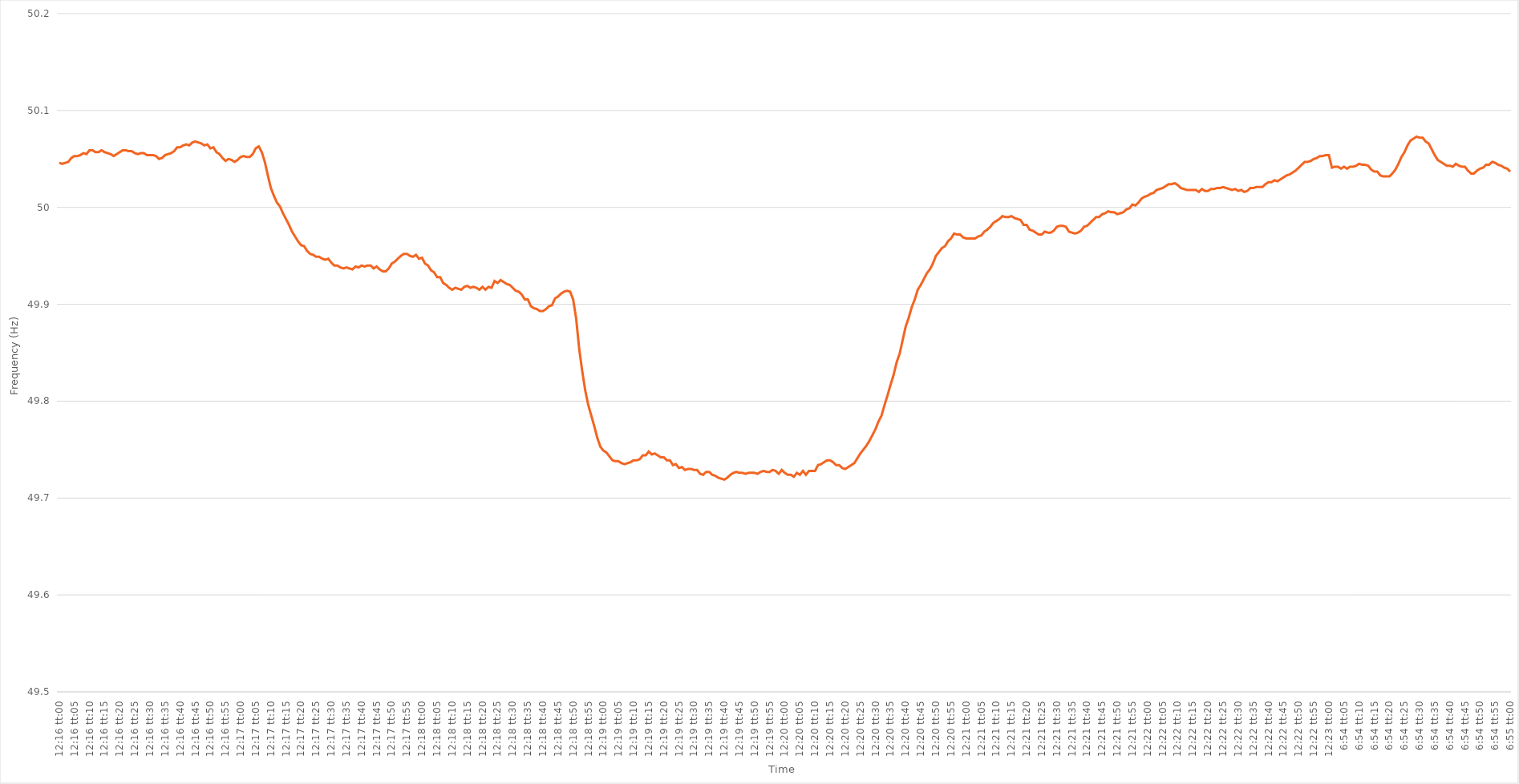
| Category | Series 0 |
|---|---|
| 0.5111111111111112 | 50.046 |
| 0.5111226851851852 | 50.045 |
| 0.5111342592592593 | 50.046 |
| 0.5111458333333333 | 50.047 |
| 0.5111574074074073 | 50.051 |
| 0.5111689814814815 | 50.053 |
| 0.5111805555555555 | 50.053 |
| 0.5111921296296297 | 50.054 |
| 0.5112037037037037 | 50.056 |
| 0.5112152777777778 | 50.055 |
| 0.5112268518518518 | 50.059 |
| 0.5112384259259259 | 50.059 |
| 0.51125 | 50.057 |
| 0.5112615740740741 | 50.057 |
| 0.5112731481481482 | 50.059 |
| 0.5112847222222222 | 50.057 |
| 0.5112962962962962 | 50.056 |
| 0.5113078703703704 | 50.055 |
| 0.5113194444444444 | 50.053 |
| 0.5113310185185186 | 50.055 |
| 0.5113425925925926 | 50.057 |
| 0.5113541666666667 | 50.059 |
| 0.5113657407407407 | 50.059 |
| 0.5113773148148147 | 50.058 |
| 0.5113888888888889 | 50.058 |
| 0.5114004629629629 | 50.056 |
| 0.5114120370370371 | 50.055 |
| 0.5114236111111111 | 50.056 |
| 0.5114351851851852 | 50.056 |
| 0.5114467592592592 | 50.054 |
| 0.5114583333333333 | 50.054 |
| 0.5114699074074074 | 50.054 |
| 0.5114814814814815 | 50.053 |
| 0.5114930555555556 | 50.05 |
| 0.5115046296296296 | 50.051 |
| 0.5115162037037037 | 50.054 |
| 0.5115277777777778 | 50.055 |
| 0.5115393518518518 | 50.056 |
| 0.511550925925926 | 50.058 |
| 0.5115625 | 50.062 |
| 0.5115740740740741 | 50.062 |
| 0.5115856481481481 | 50.064 |
| 0.5115972222222221 | 50.065 |
| 0.5116087962962963 | 50.064 |
| 0.5116203703703703 | 50.067 |
| 0.5116319444444445 | 50.068 |
| 0.5116435185185185 | 50.067 |
| 0.5116550925925926 | 50.066 |
| 0.5116666666666666 | 50.064 |
| 0.5116782407407408 | 50.065 |
| 0.5116898148148148 | 50.061 |
| 0.5117013888888889 | 50.062 |
| 0.511712962962963 | 50.057 |
| 0.511724537037037 | 50.055 |
| 0.5117361111111111 | 50.051 |
| 0.5117476851851852 | 50.048 |
| 0.5117592592592592 | 50.05 |
| 0.5117708333333334 | 50.049 |
| 0.5117824074074074 | 50.047 |
| 0.5117939814814815 | 50.049 |
| 0.5118055555555555 | 50.052 |
| 0.5118171296296297 | 50.053 |
| 0.5118287037037037 | 50.052 |
| 0.5118402777777779 | 50.052 |
| 0.5118518518518519 | 50.055 |
| 0.5118634259259259 | 50.061 |
| 0.511875 | 50.063 |
| 0.511886574074074 | 50.057 |
| 0.5118981481481482 | 50.047 |
| 0.5119097222222222 | 50.033 |
| 0.5119212962962963 | 50.02 |
| 0.5119328703703704 | 50.012 |
| 0.5119444444444444 | 50.005 |
| 0.5119560185185185 | 50.001 |
| 0.5119675925925926 | 49.994 |
| 0.5119791666666667 | 49.988 |
| 0.5119907407407408 | 49.982 |
| 0.5120023148148148 | 49.975 |
| 0.5120138888888889 | 49.97 |
| 0.5120254629629629 | 49.965 |
| 0.5120370370370371 | 49.961 |
| 0.5120486111111111 | 49.96 |
| 0.5120601851851853 | 49.955 |
| 0.5120717592592593 | 49.952 |
| 0.5120833333333333 | 49.951 |
| 0.5120949074074074 | 49.949 |
| 0.5121064814814814 | 49.949 |
| 0.5121180555555556 | 49.947 |
| 0.5121296296296296 | 49.946 |
| 0.5121412037037038 | 49.947 |
| 0.5121527777777778 | 49.943 |
| 0.5121643518518518 | 49.94 |
| 0.5121759259259259 | 49.94 |
| 0.5121875 | 49.938 |
| 0.5121990740740741 | 49.937 |
| 0.5122106481481482 | 49.938 |
| 0.5122222222222222 | 49.937 |
| 0.5122337962962963 | 49.936 |
| 0.5122453703703703 | 49.939 |
| 0.5122569444444445 | 49.938 |
| 0.5122685185185185 | 49.94 |
| 0.5122800925925927 | 49.939 |
| 0.5122916666666667 | 49.94 |
| 0.5123032407407407 | 49.94 |
| 0.5123148148148148 | 49.937 |
| 0.5123263888888888 | 49.939 |
| 0.512337962962963 | 49.936 |
| 0.512349537037037 | 49.934 |
| 0.5123611111111112 | 49.934 |
| 0.5123726851851852 | 49.937 |
| 0.5123842592592592 | 49.942 |
| 0.5123958333333333 | 49.944 |
| 0.5124074074074074 | 49.947 |
| 0.5124189814814815 | 49.95 |
| 0.5124305555555556 | 49.952 |
| 0.5124421296296297 | 49.952 |
| 0.5124537037037037 | 49.95 |
| 0.5124652777777777 | 49.949 |
| 0.5124768518518519 | 49.951 |
| 0.5124884259259259 | 49.947 |
| 0.5125000000000001 | 49.948 |
| 0.5125115740740741 | 49.942 |
| 0.5125231481481481 | 49.94 |
| 0.5125347222222222 | 49.935 |
| 0.5125462962962963 | 49.933 |
| 0.5125578703703704 | 49.928 |
| 0.5125694444444444 | 49.928 |
| 0.5125810185185186 | 49.922 |
| 0.5125925925925926 | 49.92 |
| 0.5126041666666666 | 49.917 |
| 0.5126157407407407 | 49.915 |
| 0.5126273148148148 | 49.917 |
| 0.5126388888888889 | 49.916 |
| 0.512650462962963 | 49.915 |
| 0.512662037037037 | 49.918 |
| 0.5126736111111111 | 49.919 |
| 0.5126851851851851 | 49.917 |
| 0.5126967592592593 | 49.918 |
| 0.5127083333333333 | 49.917 |
| 0.5127199074074075 | 49.915 |
| 0.5127314814814815 | 49.918 |
| 0.5127430555555555 | 49.915 |
| 0.5127546296296296 | 49.918 |
| 0.5127662037037037 | 49.917 |
| 0.5127777777777778 | 49.924 |
| 0.5127893518518518 | 49.922 |
| 0.512800925925926 | 49.925 |
| 0.5128125 | 49.923 |
| 0.512824074074074 | 49.921 |
| 0.5128356481481481 | 49.92 |
| 0.5128472222222222 | 49.917 |
| 0.5128587962962963 | 49.914 |
| 0.5128703703703704 | 49.913 |
| 0.5128819444444445 | 49.91 |
| 0.5128935185185185 | 49.905 |
| 0.5129050925925925 | 49.905 |
| 0.5129166666666667 | 49.898 |
| 0.5129282407407407 | 49.896 |
| 0.5129398148148149 | 49.895 |
| 0.5129513888888889 | 49.893 |
| 0.512962962962963 | 49.893 |
| 0.512974537037037 | 49.895 |
| 0.5129861111111111 | 49.898 |
| 0.5129976851851852 | 49.899 |
| 0.5130092592592593 | 49.906 |
| 0.5130208333333334 | 49.908 |
| 0.5130324074074074 | 49.911 |
| 0.5130439814814814 | 49.913 |
| 0.5130555555555555 | 49.914 |
| 0.5130671296296296 | 49.913 |
| 0.5130787037037037 | 49.905 |
| 0.5130902777777778 | 49.885 |
| 0.5131018518518519 | 49.854 |
| 0.5131134259259259 | 49.831 |
| 0.5131249999999999 | 49.811 |
| 0.5131365740740741 | 49.796 |
| 0.5131481481481481 | 49.785 |
| 0.5131597222222223 | 49.774 |
| 0.5131712962962963 | 49.762 |
| 0.5131828703703704 | 49.753 |
| 0.5131944444444444 | 49.749 |
| 0.5132060185185185 | 49.747 |
| 0.5132175925925926 | 49.743 |
| 0.5132291666666667 | 49.739 |
| 0.5132407407407408 | 49.738 |
| 0.5132523148148148 | 49.738 |
| 0.5132638888888889 | 49.736 |
| 0.5132754629629629 | 49.735 |
| 0.513287037037037 | 49.736 |
| 0.5132986111111111 | 49.737 |
| 0.5133101851851852 | 49.739 |
| 0.5133217592592593 | 49.739 |
| 0.5133333333333333 | 49.74 |
| 0.5133449074074073 | 49.744 |
| 0.5133564814814815 | 49.744 |
| 0.5133680555555555 | 49.748 |
| 0.5133796296296297 | 49.745 |
| 0.5133912037037037 | 49.746 |
| 0.5134027777777778 | 49.744 |
| 0.5134143518518518 | 49.742 |
| 0.513425925925926 | 49.742 |
| 0.5134375 | 49.739 |
| 0.5134490740740741 | 49.739 |
| 0.5134606481481482 | 49.734 |
| 0.5134722222222222 | 49.735 |
| 0.5134837962962963 | 49.731 |
| 0.5134953703703703 | 49.732 |
| 0.5135069444444444 | 49.729 |
| 0.5135185185185185 | 49.73 |
| 0.5135300925925926 | 49.73 |
| 0.5135416666666667 | 49.729 |
| 0.5135532407407407 | 49.729 |
| 0.5135648148148148 | 49.725 |
| 0.5135763888888889 | 49.724 |
| 0.5135879629629629 | 49.727 |
| 0.5135995370370371 | 49.727 |
| 0.5136111111111111 | 49.724 |
| 0.5136226851851852 | 49.723 |
| 0.5136342592592592 | 49.721 |
| 0.5136458333333334 | 49.72 |
| 0.5136574074074074 | 49.719 |
| 0.5136689814814815 | 49.721 |
| 0.5136805555555556 | 49.724 |
| 0.5136921296296296 | 49.726 |
| 0.5137037037037037 | 49.727 |
| 0.5137152777777778 | 49.726 |
| 0.5137268518518519 | 49.726 |
| 0.513738425925926 | 49.725 |
| 0.51375 | 49.726 |
| 0.5137615740740741 | 49.726 |
| 0.5137731481481481 | 49.726 |
| 0.5137847222222222 | 49.725 |
| 0.5137962962962963 | 49.727 |
| 0.5138078703703703 | 49.728 |
| 0.5138194444444445 | 49.727 |
| 0.5138310185185185 | 49.727 |
| 0.5138425925925926 | 49.729 |
| 0.5138541666666666 | 49.728 |
| 0.5138657407407408 | 49.725 |
| 0.5138773148148148 | 49.729 |
| 0.513888888888889 | 49.726 |
| 0.513900462962963 | 49.724 |
| 0.513912037037037 | 49.724 |
| 0.5139236111111111 | 49.722 |
| 0.5139351851851852 | 49.726 |
| 0.5139467592592593 | 49.724 |
| 0.5139583333333334 | 49.728 |
| 0.5139699074074074 | 49.724 |
| 0.5139814814814815 | 49.728 |
| 0.5139930555555555 | 49.728 |
| 0.5140046296296296 | 49.728 |
| 0.5140162037037037 | 49.734 |
| 0.5140277777777778 | 49.735 |
| 0.5140393518518519 | 49.737 |
| 0.5140509259259259 | 49.739 |
| 0.5140625 | 49.739 |
| 0.514074074074074 | 49.737 |
| 0.5140856481481482 | 49.734 |
| 0.5140972222222222 | 49.734 |
| 0.5141087962962964 | 49.731 |
| 0.5141203703703704 | 49.73 |
| 0.5141319444444444 | 49.732 |
| 0.5141435185185185 | 49.734 |
| 0.5141550925925926 | 49.736 |
| 0.5141666666666667 | 49.741 |
| 0.5141782407407408 | 49.746 |
| 0.5141898148148148 | 49.75 |
| 0.5142013888888889 | 49.754 |
| 0.5142129629629629 | 49.759 |
| 0.514224537037037 | 49.765 |
| 0.5142361111111111 | 49.771 |
| 0.5142476851851852 | 49.779 |
| 0.5142592592592593 | 49.785 |
| 0.5142708333333333 | 49.796 |
| 0.5142824074074074 | 49.806 |
| 0.5142939814814814 | 49.817 |
| 0.5143055555555556 | 49.827 |
| 0.5143171296296296 | 49.84 |
| 0.5143287037037038 | 49.849 |
| 0.5143402777777778 | 49.863 |
| 0.5143518518518518 | 49.877 |
| 0.5143634259259259 | 49.886 |
| 0.514375 | 49.897 |
| 0.5143865740740741 | 49.905 |
| 0.5143981481481482 | 49.915 |
| 0.5144097222222223 | 49.92 |
| 0.5144212962962963 | 49.926 |
| 0.5144328703703703 | 49.932 |
| 0.5144444444444445 | 49.936 |
| 0.5144560185185185 | 49.942 |
| 0.5144675925925926 | 49.95 |
| 0.5144791666666667 | 49.954 |
| 0.5144907407407407 | 49.958 |
| 0.5145023148148148 | 49.96 |
| 0.5145138888888888 | 49.965 |
| 0.514525462962963 | 49.968 |
| 0.514537037037037 | 49.973 |
| 0.5145486111111112 | 49.972 |
| 0.5145601851851852 | 49.972 |
| 0.5145717592592592 | 49.969 |
| 0.5145833333333333 | 49.968 |
| 0.5145949074074074 | 49.968 |
| 0.5146064814814815 | 49.968 |
| 0.5146180555555556 | 49.968 |
| 0.5146296296296297 | 49.97 |
| 0.5146412037037037 | 49.971 |
| 0.5146527777777777 | 49.975 |
| 0.5146643518518519 | 49.977 |
| 0.5146759259259259 | 49.98 |
| 0.5146875 | 49.984 |
| 0.5146990740740741 | 49.986 |
| 0.5147106481481482 | 49.988 |
| 0.5147222222222222 | 49.991 |
| 0.5147337962962962 | 49.99 |
| 0.5147453703703704 | 49.99 |
| 0.5147569444444444 | 49.991 |
| 0.5147685185185186 | 49.989 |
| 0.5147800925925926 | 49.988 |
| 0.5147916666666666 | 49.987 |
| 0.5148032407407407 | 49.982 |
| 0.5148148148148148 | 49.982 |
| 0.5148263888888889 | 49.977 |
| 0.514837962962963 | 49.976 |
| 0.5148495370370371 | 49.974 |
| 0.5148611111111111 | 49.972 |
| 0.5148726851851851 | 49.972 |
| 0.5148842592592593 | 49.975 |
| 0.5148958333333333 | 49.974 |
| 0.5149074074074074 | 49.974 |
| 0.5149189814814815 | 49.976 |
| 0.5149305555555556 | 49.98 |
| 0.5149421296296296 | 49.981 |
| 0.5149537037037036 | 49.981 |
| 0.5149652777777778 | 49.98 |
| 0.5149768518518518 | 49.975 |
| 0.514988425925926 | 49.974 |
| 0.515 | 49.973 |
| 0.515011574074074 | 49.974 |
| 0.5150231481481481 | 49.976 |
| 0.5150347222222222 | 49.98 |
| 0.5150462962962963 | 49.981 |
| 0.5150578703703704 | 49.984 |
| 0.5150694444444445 | 49.987 |
| 0.5150810185185185 | 49.99 |
| 0.5150925925925925 | 49.99 |
| 0.5151041666666667 | 49.993 |
| 0.5151157407407407 | 49.994 |
| 0.5151273148148149 | 49.996 |
| 0.5151388888888889 | 49.995 |
| 0.515150462962963 | 49.995 |
| 0.515162037037037 | 49.993 |
| 0.515173611111111 | 49.994 |
| 0.5151851851851852 | 49.995 |
| 0.5151967592592592 | 49.998 |
| 0.5152083333333334 | 49.999 |
| 0.5152199074074074 | 50.003 |
| 0.5152314814814815 | 50.002 |
| 0.5152430555555555 | 50.005 |
| 0.5152546296296296 | 50.009 |
| 0.5152662037037037 | 50.011 |
| 0.5152777777777778 | 50.012 |
| 0.5152893518518519 | 50.014 |
| 0.5153009259259259 | 50.015 |
| 0.5153125 | 50.018 |
| 0.5153240740740741 | 50.019 |
| 0.5153356481481481 | 50.02 |
| 0.5153472222222223 | 50.022 |
| 0.5153587962962963 | 50.024 |
| 0.5153703703703704 | 50.024 |
| 0.5153819444444444 | 50.025 |
| 0.5153935185185184 | 50.023 |
| 0.5154050925925926 | 50.02 |
| 0.5154166666666666 | 50.019 |
| 0.5154282407407408 | 50.018 |
| 0.5154398148148148 | 50.018 |
| 0.5154513888888889 | 50.018 |
| 0.5154629629629629 | 50.018 |
| 0.515474537037037 | 50.016 |
| 0.5154861111111111 | 50.019 |
| 0.5154976851851852 | 50.017 |
| 0.5155092592592593 | 50.017 |
| 0.5155208333333333 | 50.019 |
| 0.5155324074074074 | 50.019 |
| 0.5155439814814815 | 50.02 |
| 0.5155555555555555 | 50.02 |
| 0.5155671296296297 | 50.021 |
| 0.5155787037037037 | 50.02 |
| 0.5155902777777778 | 50.019 |
| 0.5156018518518518 | 50.018 |
| 0.515613425925926 | 50.019 |
| 0.515625 | 50.017 |
| 0.515636574074074 | 50.018 |
| 0.5156481481481482 | 50.016 |
| 0.5156597222222222 | 50.017 |
| 0.5156712962962963 | 50.02 |
| 0.5156828703703703 | 50.02 |
| 0.5156944444444445 | 50.021 |
| 0.5157060185185185 | 50.021 |
| 0.5157175925925926 | 50.021 |
| 0.5157291666666667 | 50.024 |
| 0.5157407407407407 | 50.026 |
| 0.5157523148148148 | 50.026 |
| 0.5157638888888889 | 50.028 |
| 0.515775462962963 | 50.027 |
| 0.5157870370370371 | 50.029 |
| 0.5157986111111111 | 50.031 |
| 0.5158101851851852 | 50.033 |
| 0.5158217592592592 | 50.034 |
| 0.5158333333333334 | 50.036 |
| 0.5158449074074074 | 50.038 |
| 0.5158564814814816 | 50.041 |
| 0.5158680555555556 | 50.044 |
| 0.5158796296296296 | 50.047 |
| 0.5158912037037037 | 50.047 |
| 0.5159027777777777 | 50.048 |
| 0.5159143518518519 | 50.05 |
| 0.5159259259259259 | 50.051 |
| 0.5159375 | 50.053 |
| 0.5159490740740741 | 50.053 |
| 0.5159606481481481 | 50.054 |
| 0.5159722222222222 | 50.054 |
| 0.28751157407407407 | 50.041 |
| 0.28752314814814817 | 50.042 |
| 0.2875347222222222 | 50.042 |
| 0.2875462962962963 | 50.04 |
| 0.28755787037037034 | 50.042 |
| 0.28756944444444443 | 50.04 |
| 0.2875810185185185 | 50.042 |
| 0.28759259259259257 | 50.042 |
| 0.28760416666666666 | 50.043 |
| 0.28761574074074076 | 50.045 |
| 0.2876273148148148 | 50.044 |
| 0.2876388888888889 | 50.044 |
| 0.287650462962963 | 50.043 |
| 0.287662037037037 | 50.039 |
| 0.2876736111111111 | 50.037 |
| 0.2876851851851852 | 50.037 |
| 0.28769675925925925 | 50.033 |
| 0.28770833333333334 | 50.032 |
| 0.28771990740740744 | 50.032 |
| 0.2877314814814815 | 50.032 |
| 0.28774305555555557 | 50.035 |
| 0.2877546296296296 | 50.039 |
| 0.2877662037037037 | 50.045 |
| 0.28777777777777774 | 50.052 |
| 0.28778935185185184 | 50.057 |
| 0.28780092592592593 | 50.064 |
| 0.28781249999999997 | 50.069 |
| 0.28782407407407407 | 50.071 |
| 0.28783564814814816 | 50.073 |
| 0.2878472222222222 | 50.072 |
| 0.2878587962962963 | 50.072 |
| 0.2878703703703704 | 50.068 |
| 0.2878819444444444 | 50.066 |
| 0.2878935185185185 | 50.06 |
| 0.2879050925925926 | 50.054 |
| 0.28791666666666665 | 50.049 |
| 0.28792824074074075 | 50.047 |
| 0.28793981481481484 | 50.045 |
| 0.2879513888888889 | 50.043 |
| 0.287962962962963 | 50.043 |
| 0.287974537037037 | 50.042 |
| 0.2879861111111111 | 50.045 |
| 0.28799768518518515 | 50.043 |
| 0.2880092592592593 | 50.042 |
| 0.28802083333333334 | 50.042 |
| 0.2880324074074074 | 50.038 |
| 0.28804398148148147 | 50.035 |
| 0.28805555555555556 | 50.035 |
| 0.2880671296296296 | 50.038 |
| 0.2880787037037037 | 50.04 |
| 0.2880902777777778 | 50.041 |
| 0.28810185185185183 | 50.044 |
| 0.2881134259259259 | 50.044 |
| 0.288125 | 50.047 |
| 0.28813657407407406 | 50.046 |
| 0.28814814814814815 | 50.044 |
| 0.28815972222222225 | 50.043 |
| 0.2881712962962963 | 50.041 |
| 0.2881828703703704 | 50.04 |
| 0.2881944444444445 | 50.037 |